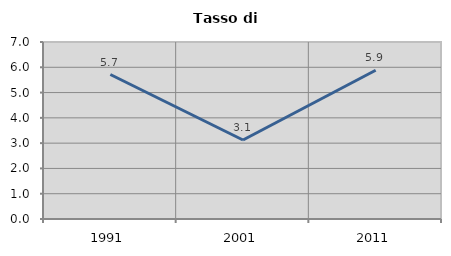
| Category | Tasso di disoccupazione   |
|---|---|
| 1991.0 | 5.714 |
| 2001.0 | 3.125 |
| 2011.0 | 5.882 |